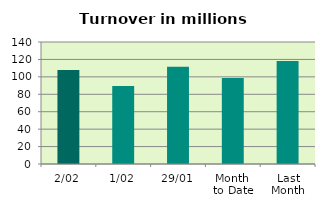
| Category | Series 0 |
|---|---|
| 2/02 | 107.759 |
| 1/02 | 89.509 |
| 29/01 | 111.738 |
| Month 
to Date | 98.634 |
| Last
Month | 118.136 |